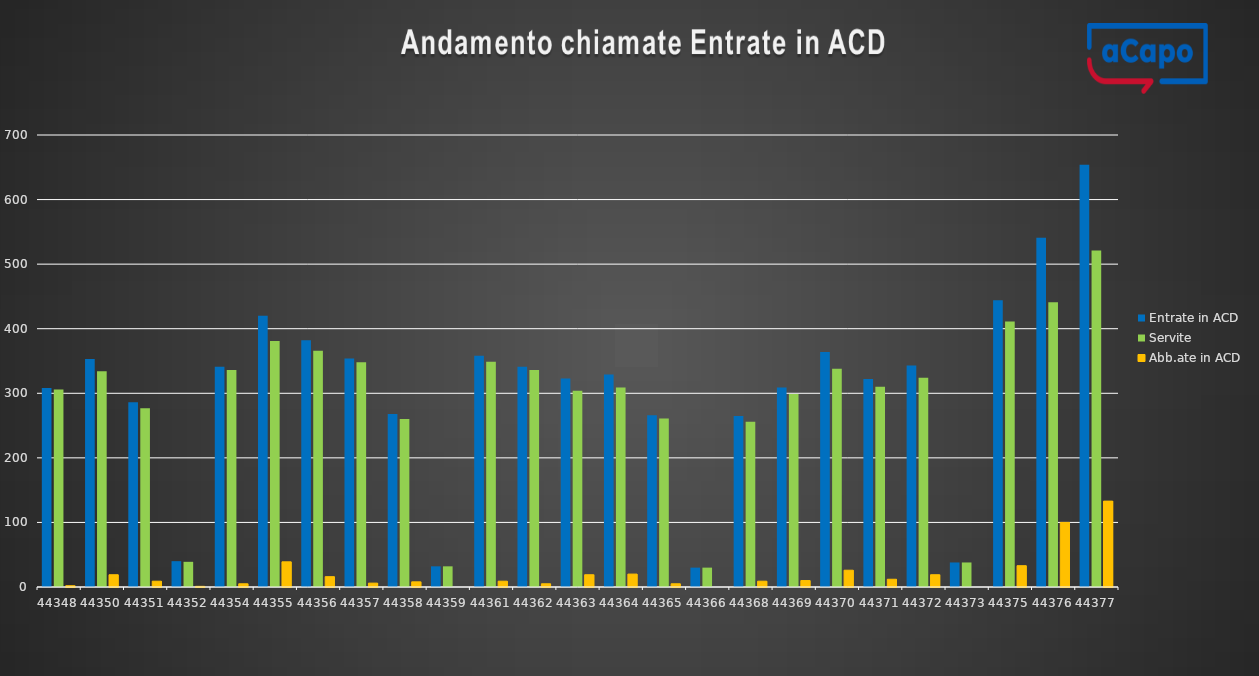
| Category | Entrate in ACD | Servite | Abb.ate in ACD |
|---|---|---|---|
| 2021-06-01 | 308 | 306 | 2 |
| 2021-06-03 | 353 | 334 | 19 |
| 2021-06-04 | 286 | 277 | 9 |
| 2021-06-05 | 40 | 39 | 1 |
| 2021-06-07 | 341 | 336 | 5 |
| 2021-06-08 | 420 | 381 | 39 |
| 2021-06-09 | 382 | 366 | 16 |
| 2021-06-10 | 354 | 348 | 6 |
| 2021-06-11 | 268 | 260 | 8 |
| 2021-06-12 | 32 | 32 | 0 |
| 2021-06-14 | 358 | 349 | 9 |
| 2021-06-15 | 341 | 336 | 5 |
| 2021-06-16 | 323 | 304 | 19 |
| 2021-06-17 | 329 | 309 | 20 |
| 2021-06-18 | 266 | 261 | 5 |
| 2021-06-19 | 30 | 30 | 0 |
| 2021-06-21 | 265 | 256 | 9 |
| 2021-06-22 | 309 | 299 | 10 |
| 2021-06-23 | 364 | 338 | 26 |
| 2021-06-24 | 322 | 310 | 12 |
| 2021-06-25 | 343 | 324 | 19 |
| 2021-06-26 | 38 | 38 | 0 |
| 2021-06-28 | 444 | 411 | 33 |
| 2021-06-29 | 541 | 441 | 100 |
| 2021-06-30 | 654 | 521 | 133 |